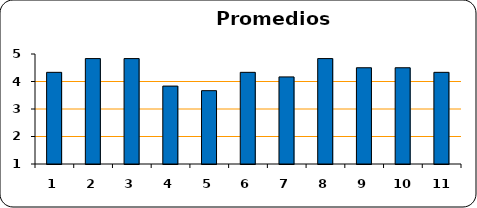
| Category | Series 0 |
|---|---|
| 0 | 4.333 |
| 1 | 4.833 |
| 2 | 4.833 |
| 3 | 3.833 |
| 4 | 3.667 |
| 5 | 4.333 |
| 6 | 4.167 |
| 7 | 4.833 |
| 8 | 4.5 |
| 9 | 4.5 |
| 10 | 4.333 |